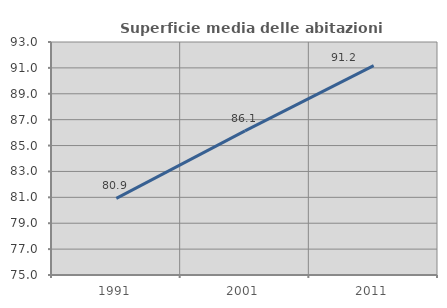
| Category | Superficie media delle abitazioni occupate |
|---|---|
| 1991.0 | 80.925 |
| 2001.0 | 86.14 |
| 2011.0 | 91.18 |